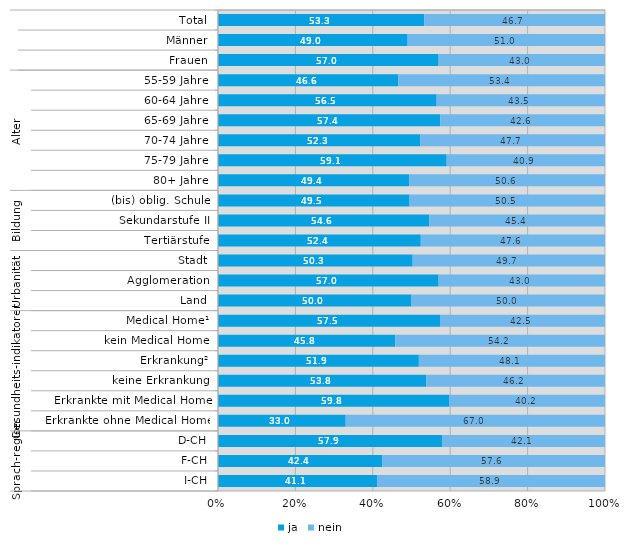
| Category | ja | nein |
|---|---|---|
| 0 | 53.3 | 46.7 |
| 1 | 49 | 51 |
| 2 | 57 | 43 |
| 3 | 46.6 | 53.4 |
| 4 | 56.5 | 43.5 |
| 5 | 57.4 | 42.6 |
| 6 | 52.3 | 47.7 |
| 7 | 59.1 | 40.9 |
| 8 | 49.4 | 50.6 |
| 9 | 49.5 | 50.5 |
| 10 | 54.6 | 45.4 |
| 11 | 52.4 | 47.6 |
| 12 | 50.3 | 49.7 |
| 13 | 57 | 43 |
| 14 | 50 | 50 |
| 15 | 57.5 | 42.5 |
| 16 | 45.8 | 54.2 |
| 17 | 51.9 | 48.1 |
| 18 | 53.8 | 46.2 |
| 19 | 59.8 | 40.2 |
| 20 | 33 | 67 |
| 21 | 57.9 | 42.1 |
| 22 | 42.4 | 57.6 |
| 23 | 41.1 | 58.9 |